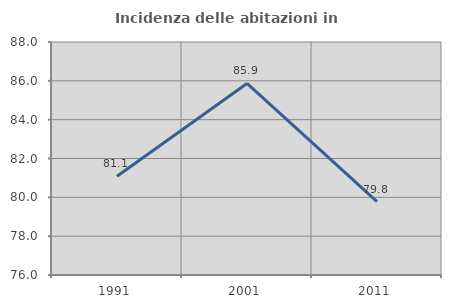
| Category | Incidenza delle abitazioni in proprietà  |
|---|---|
| 1991.0 | 81.081 |
| 2001.0 | 85.864 |
| 2011.0 | 79.775 |